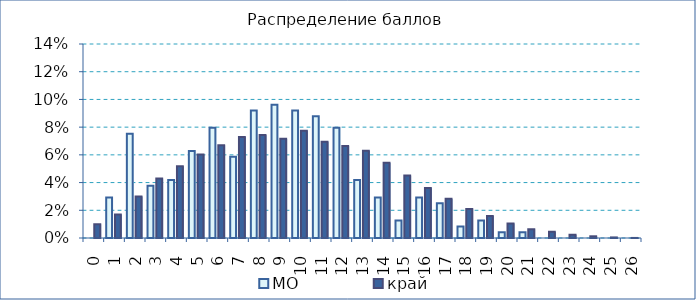
| Category | МО | край |
|---|---|---|
| 0.0 | 0 | 0.01 |
| 1.0 | 0.029 | 0.017 |
| 2.0 | 0.075 | 0.03 |
| 3.0 | 0.038 | 0.043 |
| 4.0 | 0.042 | 0.052 |
| 5.0 | 0.063 | 0.06 |
| 6.0 | 0.079 | 0.067 |
| 7.0 | 0.059 | 0.073 |
| 8.0 | 0.092 | 0.074 |
| 9.0 | 0.096 | 0.072 |
| 10.0 | 0.092 | 0.077 |
| 11.0 | 0.088 | 0.069 |
| 12.0 | 0.079 | 0.066 |
| 13.0 | 0.042 | 0.063 |
| 14.0 | 0.029 | 0.054 |
| 15.0 | 0.013 | 0.045 |
| 16.0 | 0.029 | 0.036 |
| 17.0 | 0.025 | 0.028 |
| 18.0 | 0.008 | 0.021 |
| 19.0 | 0.013 | 0.016 |
| 20.0 | 0.004 | 0.011 |
| 21.0 | 0.004 | 0.006 |
| 22.0 | 0 | 0.004 |
| 23.0 | 0 | 0.002 |
| 24.0 | 0 | 0.001 |
| 25.0 | 0 | 0 |
| 26.0 | 0 | 0 |